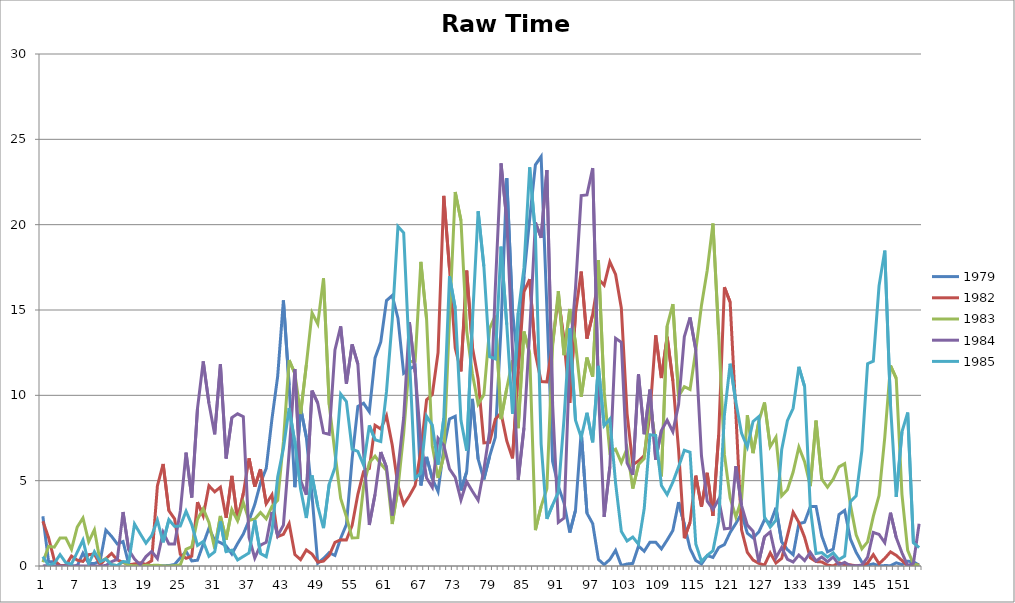
| Category | 1979 | 1982 | 1983 | 1984 | 1985 |
|---|---|---|---|---|---|
| 0 | 2.914 | 2.624 | 0.224 | 0.007 | 0.547 |
| 1 | 0.24 | 1.658 | 1.148 | 0.01 | 0.035 |
| 2 | 0.25 | 0.319 | 1.106 | 0 | 0.162 |
| 3 | 0 | 0.033 | 1.643 | 0 | 0.665 |
| 4 | 0.003 | 0.021 | 1.645 | 0 | 0.193 |
| 5 | 0 | 0.581 | 0.977 | 0 | 0.118 |
| 6 | 0.01 | 0.343 | 2.281 | 0.013 | 0.805 |
| 7 | 0.75 | 0.267 | 2.813 | 0 | 1.519 |
| 8 | 0.154 | 0.667 | 1.424 | 0 | 0.142 |
| 9 | 0.143 | 0.701 | 2.122 | 0 | 0.839 |
| 10 | 0.284 | 0.077 | 0.258 | 0 | 0.258 |
| 11 | 2.102 | 0.431 | 0.431 | 0.032 | 0.407 |
| 12 | 1.737 | 0.739 | 0.08 | 0.253 | 0.076 |
| 13 | 1.291 | 0.354 | 0.012 | 0.388 | 0.023 |
| 14 | 1.433 | 0.212 | 0.252 | 3.159 | 0.267 |
| 15 | 0.1 | 0.066 | 0.034 | 0.941 | 0.218 |
| 16 | 0.002 | 0.124 | 0.013 | 0.404 | 2.462 |
| 17 | 0.109 | 0.187 | 0 | 0.072 | 1.889 |
| 18 | 0.014 | 0.094 | 0.041 | 0.551 | 1.339 |
| 19 | 0.016 | 0.307 | 0.032 | 0.856 | 1.787 |
| 20 | 0.002 | 4.695 | 0.051 | 0.433 | 2.68 |
| 21 | 0.021 | 5.978 | 0 | 1.978 | 1.386 |
| 22 | 0.023 | 3.241 | 0.001 | 1.293 | 2.715 |
| 23 | 0.091 | 2.759 | 0.015 | 1.284 | 2.32 |
| 24 | 0.482 | 0.683 | 0.07 | 3.226 | 2.345 |
| 25 | 0.859 | 0.449 | 0.982 | 6.644 | 3.21 |
| 26 | 0.298 | 0.582 | 1.129 | 4.013 | 2.425 |
| 27 | 0.339 | 3.74 | 2.739 | 9.24 | 1.205 |
| 28 | 1.278 | 2.937 | 3.357 | 11.989 | 1.439 |
| 29 | 2.216 | 4.701 | 2.553 | 9.527 | 0.569 |
| 30 | 1.505 | 4.347 | 1.021 | 7.718 | 0.831 |
| 31 | 1.37 | 4.62 | 2.931 | 11.821 | 2.612 |
| 32 | 1.173 | 2.826 | 1.547 | 6.298 | 0.843 |
| 33 | 0.702 | 5.28 | 3.309 | 8.695 | 0.929 |
| 34 | 1.316 | 2.688 | 2.65 | 8.917 | 0.356 |
| 35 | 1.876 | 4.253 | 3.724 | 8.754 | 0.56 |
| 36 | 2.671 | 6.307 | 2.686 | 1.691 | 0.766 |
| 37 | 3.606 | 4.648 | 2.751 | 0.468 | 2.682 |
| 38 | 4.868 | 5.673 | 3.131 | 1.222 | 0.731 |
| 39 | 5.722 | 3.649 | 2.762 | 1.387 | 0.548 |
| 40 | 8.616 | 4.177 | 3.497 | 3.169 | 2.019 |
| 41 | 11.117 | 1.722 | 3.849 | 1.783 | 5.219 |
| 42 | 15.563 | 1.857 | 7.271 | 2.396 | 6.892 |
| 43 | 10.579 | 2.49 | 12.063 | 6.663 | 9.261 |
| 44 | 4.616 | 0.673 | 11.278 | 11.541 | 7.236 |
| 45 | 9.266 | 0.376 | 8.906 | 5.008 | 4.508 |
| 46 | 7.548 | 0.937 | 11.788 | 4.174 | 2.809 |
| 47 | 4.099 | 0.7 | 14.83 | 10.276 | 5.304 |
| 48 | 0.161 | 0.23 | 14.181 | 9.544 | 3.498 |
| 49 | 0.442 | 0.283 | 16.853 | 7.801 | 2.219 |
| 50 | 0.784 | 0.625 | 9.457 | 7.719 | 4.804 |
| 51 | 0.615 | 1.382 | 6.62 | 12.657 | 5.765 |
| 52 | 1.626 | 1.541 | 3.953 | 14.041 | 10.076 |
| 53 | 2.426 | 1.524 | 2.878 | 10.683 | 9.628 |
| 54 | 6.294 | 2.377 | 1.643 | 12.985 | 6.841 |
| 55 | 9.35 | 4.198 | 1.66 | 11.834 | 6.714 |
| 56 | 9.534 | 5.534 | 4.659 | 6.602 | 5.904 |
| 57 | 9.042 | 5.717 | 6.052 | 2.402 | 8.242 |
| 58 | 12.192 | 8.247 | 6.438 | 4.209 | 7.4 |
| 59 | 13.125 | 8.027 | 5.986 | 6.676 | 7.291 |
| 60 | 15.557 | 8.797 | 5.597 | 5.786 | 10.231 |
| 61 | 15.848 | 7.09 | 2.46 | 2.957 | 14.395 |
| 62 | 14.52 | 4.707 | 4.559 | 5.67 | 19.896 |
| 63 | 11.287 | 3.607 | 7.77 | 8.688 | 19.527 |
| 64 | 11.532 | 4.111 | 11.981 | 14.288 | 12.226 |
| 65 | 11.74 | 4.718 | 11.988 | 11.353 | 5.131 |
| 66 | 4.716 | 6.748 | 17.823 | 7.29 | 5.441 |
| 67 | 6.392 | 9.736 | 14.469 | 5.158 | 8.784 |
| 68 | 5.12 | 10.047 | 7.036 | 4.612 | 8.257 |
| 69 | 4.364 | 12.498 | 5.157 | 7.487 | 5.934 |
| 70 | 6.882 | 21.686 | 6.445 | 7.084 | 8.654 |
| 71 | 8.613 | 17.419 | 14.49 | 5.69 | 16.98 |
| 72 | 8.768 | 12.768 | 21.916 | 5.194 | 15.11 |
| 73 | 4.424 | 11.407 | 20.247 | 3.865 | 8.531 |
| 74 | 5.527 | 17.309 | 13.785 | 4.937 | 6.76 |
| 75 | 9.793 | 12.81 | 11.265 | 4.376 | 14.346 |
| 76 | 6.266 | 10.957 | 9.477 | 3.85 | 20.787 |
| 77 | 5.07 | 7.212 | 10.026 | 5.652 | 17.562 |
| 78 | 6.423 | 7.244 | 13.904 | 7.881 | 12.264 |
| 79 | 7.539 | 8.604 | 14.674 | 16.292 | 12.132 |
| 80 | 14 | 8.965 | 8.605 | 23.594 | 18.716 |
| 81 | 22.728 | 7.327 | 10.418 | 20.271 | 14.145 |
| 82 | 14.947 | 6.309 | 12.056 | 12.624 | 8.921 |
| 83 | 11.702 | 11.409 | 8.078 | 5.051 | 14.834 |
| 84 | 16.962 | 16.064 | 13.738 | 8.086 | 17.468 |
| 85 | 20.334 | 16.805 | 12.454 | 13.711 | 23.364 |
| 86 | 23.504 | 12.435 | 2.104 | 20.126 | 19.443 |
| 87 | 23.987 | 10.808 | 3.496 | 19.233 | 7.143 |
| 88 | 15.165 | 10.79 | 4.528 | 23.202 | 2.765 |
| 89 | 6.139 | 13.058 | 12.885 | 9.503 | 3.571 |
| 90 | 4.679 | 15.764 | 16.104 | 2.553 | 4.331 |
| 91 | 3.687 | 13.175 | 12.359 | 2.807 | 8.629 |
| 92 | 1.958 | 9.563 | 15.061 | 12.261 | 13.925 |
| 93 | 3.261 | 14.814 | 13.087 | 16.264 | 8.542 |
| 94 | 7.88 | 17.252 | 9.916 | 21.708 | 7.537 |
| 95 | 3.092 | 13.324 | 12.213 | 21.744 | 8.979 |
| 96 | 2.486 | 14.736 | 11.098 | 23.31 | 7.248 |
| 97 | 0.385 | 16.828 | 17.922 | 10.29 | 11.722 |
| 98 | 0.081 | 16.456 | 10.261 | 2.878 | 8.219 |
| 99 | 0.383 | 17.818 | 6.633 | 5.827 | 8.61 |
| 100 | 0.918 | 17.084 | 6.845 | 13.347 | 4.848 |
| 101 | 0.029 | 15.117 | 6.061 | 13.109 | 2.031 |
| 102 | 0.117 | 8.947 | 6.876 | 6.046 | 1.465 |
| 103 | 0.153 | 5.932 | 4.538 | 5.341 | 1.697 |
| 104 | 1.17 | 6.153 | 5.942 | 11.229 | 1.277 |
| 105 | 0.866 | 6.472 | 6.297 | 7.722 | 3.366 |
| 106 | 1.397 | 8.917 | 9.612 | 10.332 | 7.69 |
| 107 | 1.397 | 13.52 | 7.121 | 6.235 | 7.65 |
| 108 | 1.002 | 11.012 | 5.251 | 7.945 | 4.717 |
| 109 | 1.519 | 13.431 | 14.058 | 8.542 | 4.183 |
| 110 | 2.081 | 10.854 | 15.34 | 7.871 | 4.916 |
| 111 | 3.744 | 6.809 | 9.945 | 9.455 | 5.811 |
| 112 | 2.432 | 1.625 | 10.505 | 13.432 | 6.782 |
| 113 | 1.021 | 2.553 | 10.345 | 14.564 | 6.665 |
| 114 | 0.324 | 5.295 | 12.63 | 12.667 | 1.3 |
| 115 | 0.12 | 3.478 | 15.284 | 6.442 | 0.268 |
| 116 | 0.609 | 5.457 | 17.329 | 3.796 | 0.621 |
| 117 | 0.501 | 2.937 | 20.068 | 3.317 | 0.896 |
| 118 | 1.082 | 7.669 | 13.574 | 3.914 | 2.605 |
| 119 | 1.253 | 16.334 | 6.538 | 2.173 | 8.863 |
| 120 | 1.964 | 15.463 | 3.983 | 2.217 | 11.852 |
| 121 | 2.492 | 8.935 | 2.874 | 5.852 | 9.615 |
| 122 | 3.075 | 2.109 | 3.902 | 3.54 | 7.768 |
| 123 | 1.922 | 0.803 | 8.829 | 2.394 | 6.97 |
| 124 | 1.647 | 0.349 | 6.613 | 2.035 | 8.469 |
| 125 | 1.989 | 0.155 | 8.472 | 0.224 | 8.749 |
| 126 | 2.711 | 0.052 | 9.578 | 1.711 | 2.874 |
| 127 | 2.505 | 0.768 | 6.992 | 1.997 | 2.279 |
| 128 | 3.414 | 0.176 | 7.545 | 0.483 | 2.691 |
| 129 | 1.41 | 0.447 | 4.108 | 1.082 | 6.81 |
| 130 | 0.961 | 1.776 | 4.471 | 0.395 | 8.511 |
| 131 | 0.66 | 3.148 | 5.507 | 0.234 | 9.243 |
| 132 | 2.479 | 2.55 | 6.971 | 0.643 | 11.672 |
| 133 | 2.566 | 1.679 | 6.115 | 0.314 | 10.517 |
| 134 | 3.477 | 0.476 | 4.681 | 0.798 | 3.405 |
| 135 | 3.491 | 0.26 | 8.513 | 0.294 | 0.727 |
| 136 | 1.757 | 0.238 | 5.086 | 0.528 | 0.79 |
| 137 | 0.83 | 0.052 | 4.613 | 0.251 | 0.518 |
| 138 | 0.989 | 0.004 | 5.084 | 0.533 | 0.773 |
| 139 | 3.013 | 0.188 | 5.807 | 0.064 | 0.373 |
| 140 | 3.259 | 0.068 | 5.993 | 0.213 | 0.582 |
| 141 | 1.583 | 0.067 | 3.589 | 0.013 | 3.768 |
| 142 | 0.8 | 0.009 | 1.826 | 0.008 | 4.109 |
| 143 | 0.224 | 0.015 | 1.009 | 0.057 | 6.754 |
| 144 | 0.047 | 0.17 | 1.413 | 0.508 | 11.851 |
| 145 | 0.126 | 0.665 | 2.906 | 1.968 | 12 |
| 146 | 0.005 | 0.134 | 4.13 | 1.85 | 16.417 |
| 147 | 0.024 | 0.446 | 7.54 | 1.365 | 18.479 |
| 148 | 0.019 | 0.828 | 11.746 | 3.125 | 9.429 |
| 149 | 0.189 | 0.624 | 10.999 | 1.667 | 4.05 |
| 150 | 0.082 | 0.324 | 4.197 | 0.769 | 7.864 |
| 151 | 0.282 | 0.007 | 0.921 | 0.028 | 8.991 |
| 152 | 0.244 | 0.024 | 0.117 | 0.154 | 1.364 |
| 153 | 0.05 | 0.068 | 0.038 | 2.476 | 1.073 |